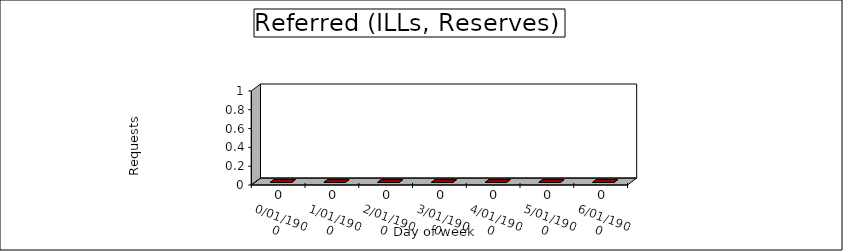
| Category | Referred (RSV, ILL, etc) |
|---|---|
| 0.0 | 0 |
| 1900-01-01 | 0 |
| 1900-01-02 | 0 |
| 1900-01-03 | 0 |
| 1900-01-04 | 0 |
| 1900-01-05 | 0 |
| 1900-01-06 | 0 |